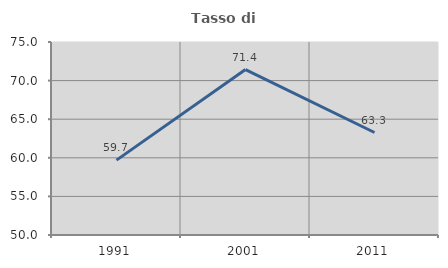
| Category | Tasso di occupazione   |
|---|---|
| 1991.0 | 59.701 |
| 2001.0 | 71.429 |
| 2011.0 | 63.277 |